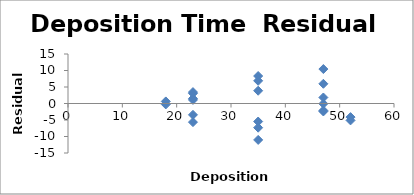
| Category | Series 0 |
|---|---|
| 18.0 | -0.282 |
| 35.0 | -11.035 |
| 52.0 | -4.122 |
| 52.0 | -5.12 |
| 18.0 | 0.627 |
| 35.0 | -7.328 |
| 35.0 | 3.872 |
| 35.0 | -5.467 |
| 23.0 | 3.074 |
| 23.0 | 1.5 |
| 47.0 | -0.066 |
| 47.0 | -2.13 |
| 47.0 | -2.416 |
| 23.0 | 3.458 |
| 23.0 | 1.085 |
| 23.0 | -3.433 |
| 23.0 | -5.646 |
| 47.0 | 5.974 |
| 47.0 | 1.819 |
| 47.0 | 10.437 |
| 35.0 | 8.326 |
| 35.0 | 6.875 |